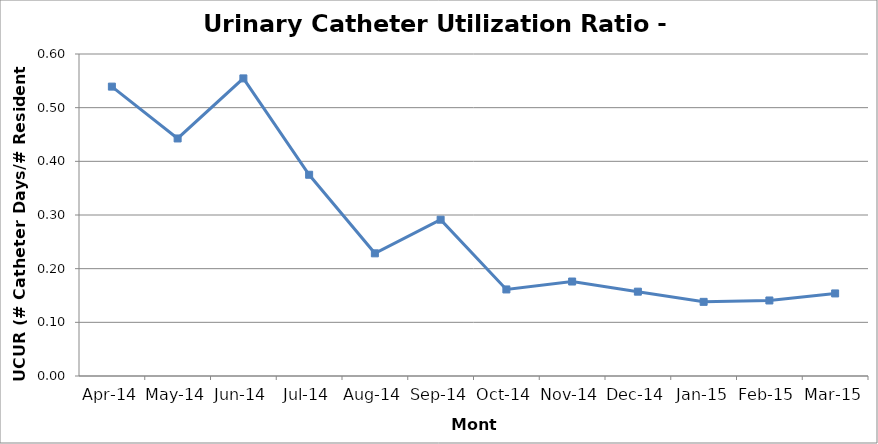
| Category | Series 2 |
|---|---|
| 2014-04-01 | 0.539 |
| 2014-05-01 | 0.443 |
| 2014-06-01 | 0.555 |
| 2014-07-01 | 0.375 |
| 2014-08-01 | 0.229 |
| 2014-09-01 | 0.291 |
| 2014-10-01 | 0.161 |
| 2014-11-01 | 0.176 |
| 2014-12-01 | 0.157 |
| 2015-01-01 | 0.138 |
| 2015-02-01 | 0.141 |
| 2015-03-01 | 0.154 |